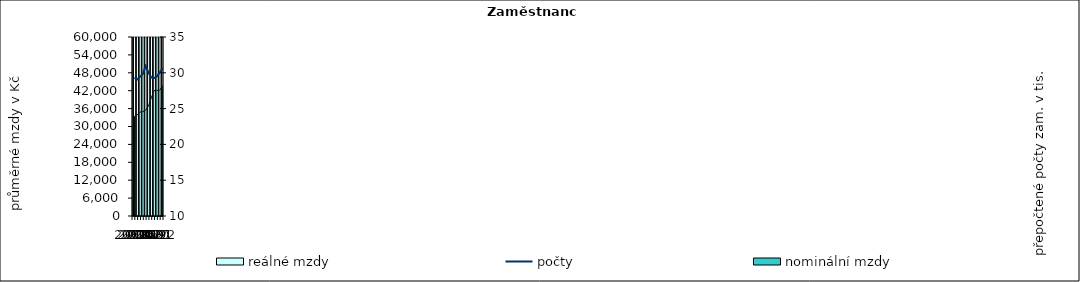
| Category | nominální mzdy  |
|---|---|
| 2012.0 | 32609.449 |
| 2013.0 | 33636.062 |
| 2014.0 | 34724.097 |
| 2015.0 | 34991.675 |
| 2016.0 | 35692.203 |
| 2017.0 | 38027.505 |
| 2018.0 | 41754.679 |
| 2019.0 | 45543.219 |
| 2020.0 | 47096.223 |
| 2021.0 | 48504.068 |
| 2022.0 | 50224.551 |